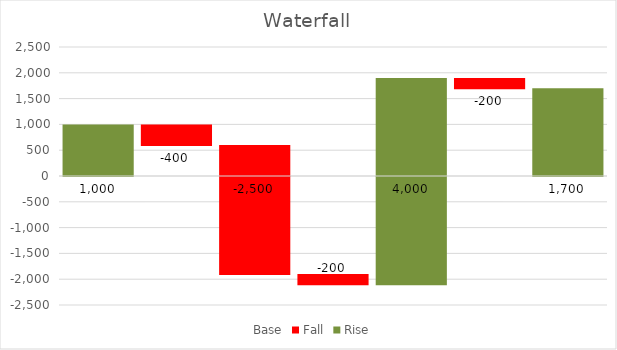
| Category | Base | Fall | Rise |
|---|---|---|---|
| GrossTurnover | 0 | 0 | 1000 |
| Returns | 600 | 400 | 0 |
| COS | 0 | 600 | -1900 |
| W&S | -1900 | 0 | -200 |
| OtherIncome | 0 | -2100 | 1900 |
| FixedCosts | 1700 | 200 | 0 |
| Result | 0 | 0 | 1700 |